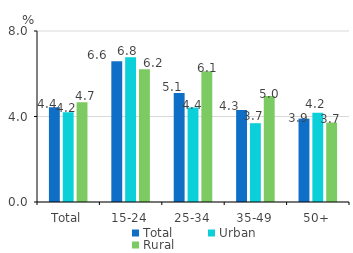
| Category | Total | Urban | Rural |
|---|---|---|---|
| Total | 4.432 | 4.203 | 4.664 |
| 15-24 | 6.591 | 6.776 | 6.21 |
| 25-34 | 5.096 | 4.424 | 6.121 |
| 35-49 | 4.306 | 3.687 | 4.958 |
| 50+ | 3.901 | 4.173 | 3.715 |